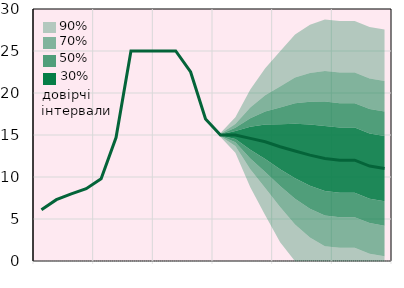
| Category | Облікова ставка, % |
|---|---|
|  | 6.1 |
|  | 7.3 |
|  | 8 |
| IV.21 | 8.6 |
|  | 9.8 |
|  | 14.7 |
|  | 25 |
| IV.22 | 25 |
|  | 25 |
|  | 25 |
|  | 22.5 |
| IV.23 | 16.9 |
|  | 15 |
|  | 15 |
|  | 14.6 |
| IV.24 | 14.2 |
|  | 13.6 |
|  | 13.1 |
|  | 12.6 |
| IV.25 | 12.2 |
|  | 12 |
|  | 12 |
|  | 11.3 |
| IV.26 | 11 |